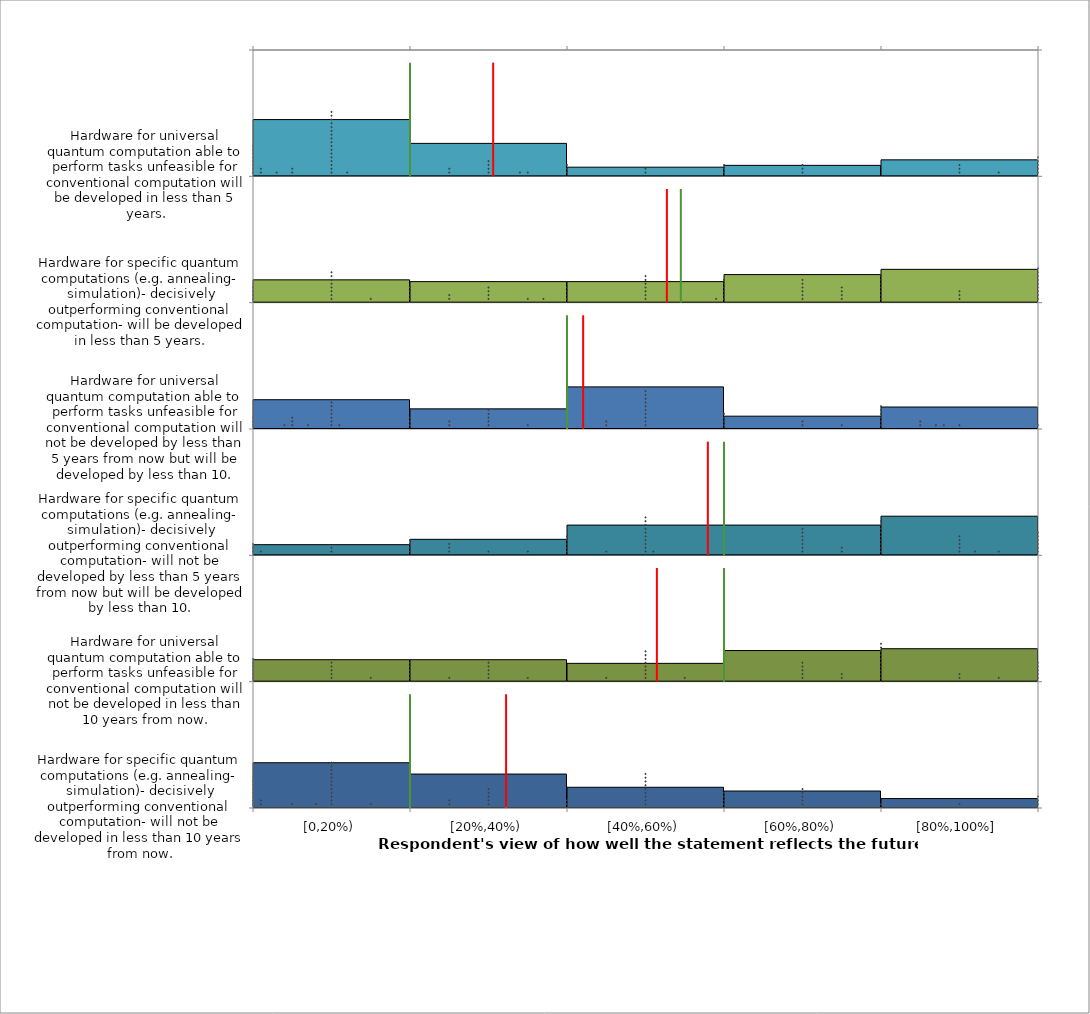
| Category | Series 0 | Series 1 | 31 | Series 3 | 29 | Series 5 | Series 7 | 28 | Series 9 |
|---|---|---|---|---|---|---|---|---|---|
| [0,20%) | 0.358 | 0.642 | 0.449 | 0.826 | 0.085 | 0.915 | 0.768 | 0.181 | 0.819 |
| [20%,40%) | 0.269 | 0.731 | 0.261 | 0.826 | 0.127 | 0.873 | 0.841 | 0.167 | 0.833 |
| [40%,60%) | 0.164 | 0.836 | 0.072 | 0.855 | 0.239 | 0.761 | 0.667 | 0.167 | 0.833 |
| [60%,80%) | 0.134 | 0.866 | 0.087 | 0.754 | 0.239 | 0.761 | 0.899 | 0.222 | 0.778 |
| [80%,100%] | 0.075 | 0.925 | 0.13 | 0.739 | 0.31 | 0.69 | 0.826 | 0.264 | 0.736 |